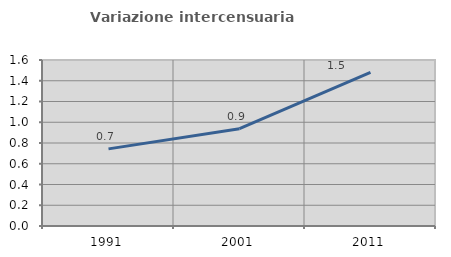
| Category | Variazione intercensuaria annua |
|---|---|
| 1991.0 | 0.744 |
| 2001.0 | 0.938 |
| 2011.0 | 1.481 |